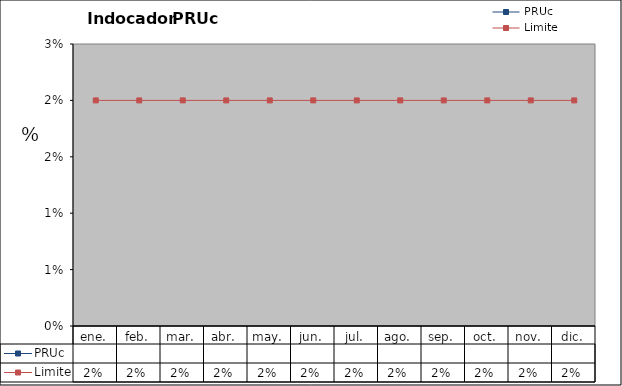
| Category | PRUc | Limite |
|---|---|---|
| ene. |  | 0.02 |
| feb. |  | 0.02 |
| mar. |  | 0.02 |
| abr. |  | 0.02 |
| may. |  | 0.02 |
| jun. |  | 0.02 |
| jul. |  | 0.02 |
| ago. |  | 0.02 |
| sep. |  | 0.02 |
| oct. |  | 0.02 |
| nov. |  | 0.02 |
| dic. |  | 0.02 |